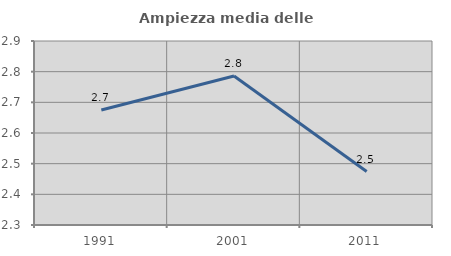
| Category | Ampiezza media delle famiglie |
|---|---|
| 1991.0 | 2.675 |
| 2001.0 | 2.786 |
| 2011.0 | 2.474 |